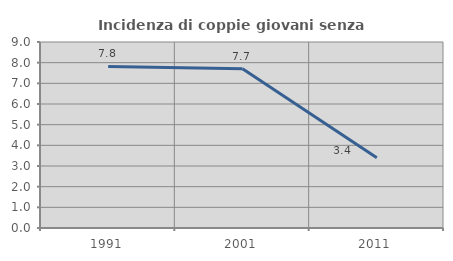
| Category | Incidenza di coppie giovani senza figli |
|---|---|
| 1991.0 | 7.815 |
| 2001.0 | 7.708 |
| 2011.0 | 3.399 |